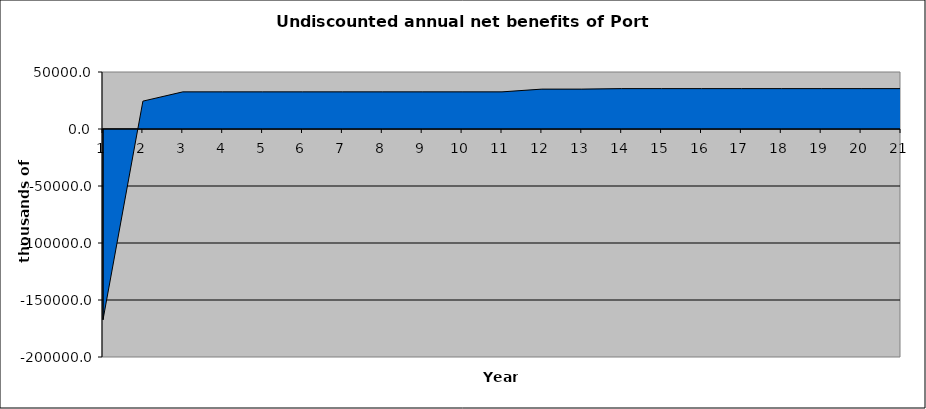
| Category | Series 0 |
|---|---|
| 0 | -167327.372 |
| 1 | 24443.296 |
| 2 | 32571.366 |
| 3 | 32571.366 |
| 4 | 32571.366 |
| 5 | 32571.366 |
| 6 | 32571.366 |
| 7 | 32571.366 |
| 8 | 32571.366 |
| 9 | 32571.366 |
| 10 | 32571.366 |
| 11 | 34988.575 |
| 12 | 34988.575 |
| 13 | 35420.565 |
| 14 | 35420.565 |
| 15 | 35420.565 |
| 16 | 35420.565 |
| 17 | 35420.565 |
| 18 | 35420.565 |
| 19 | 35420.565 |
| 20 | 35420.565 |